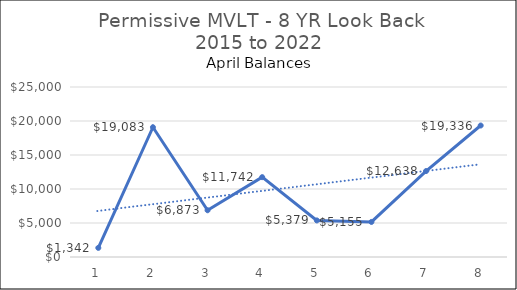
| Category | Permissive |
|---|---|
| 0 | 1342.08 |
| 1 | 19082.8 |
| 2 | 6873.46 |
| 3 | 11742.07 |
| 4 | 5378.85 |
| 5 | 5154.65 |
| 6 | 12637.5 |
| 7 | 19335.91 |